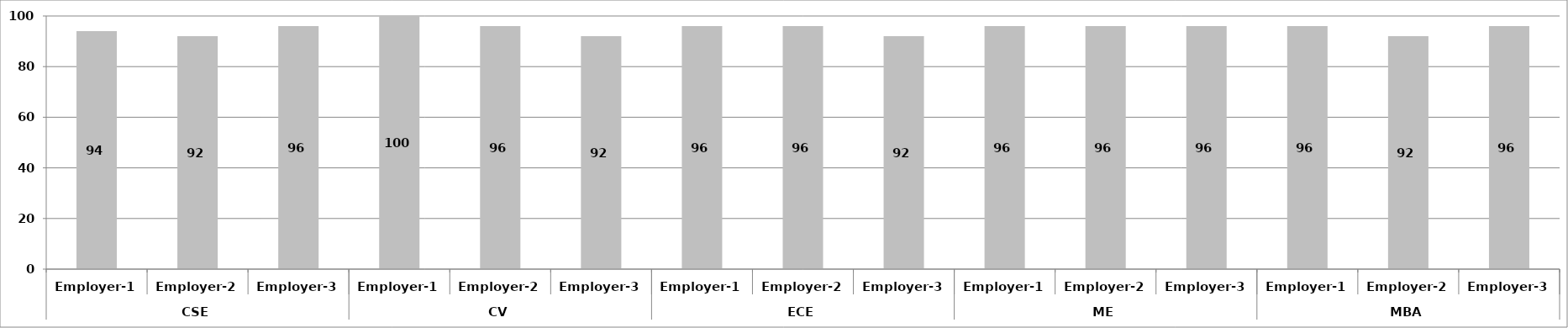
| Category | Series 0 |
|---|---|
| 0 | 94 |
| 1 | 92 |
| 2 | 96 |
| 3 | 100 |
| 4 | 96 |
| 5 | 92 |
| 6 | 96 |
| 7 | 96 |
| 8 | 92 |
| 9 | 96 |
| 10 | 96 |
| 11 | 96 |
| 12 | 96 |
| 13 | 92 |
| 14 | 96 |